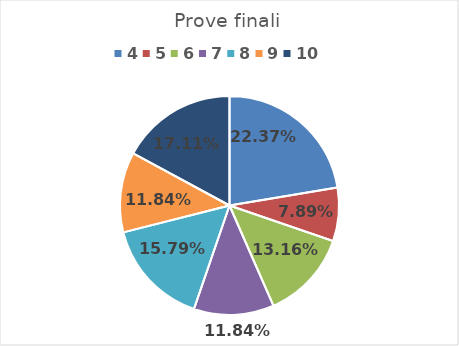
| Category | Series 0 |
|---|---|
| 4.0 | 0.224 |
| 5.0 | 0.079 |
| 6.0 | 0.132 |
| 7.0 | 0.118 |
| 8.0 | 0.158 |
| 9.0 | 0.118 |
| 10.0 | 0.171 |